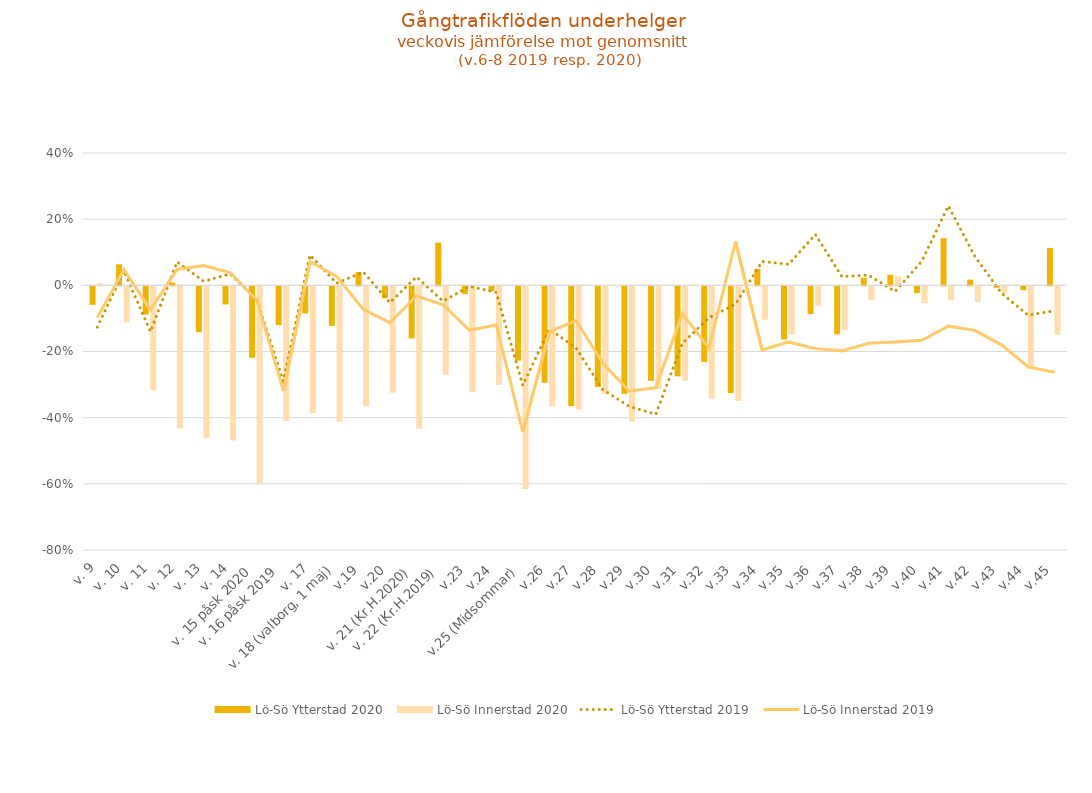
| Category | Lö-Sö |
|---|---|
| v. 9 | 0.007 |
| v. 10 | -0.109 |
| v. 11 | -0.315 |
| v. 12 | -0.429 |
| v. 13 | -0.458 |
| v. 14 | -0.466 |
| v. 15 påsk 2020 | -0.594 |
| v. 16 påsk 2019 | -0.406 |
| v. 17 | -0.383 |
| v. 18 (valborg, 1 maj) | -0.409 |
| v.19 | -0.363 |
| v.20 | -0.321 |
| v. 21 (Kr.H.2020) | -0.43 |
| v. 22 (Kr.H.2019) | -0.267 |
| v.23 | -0.32 |
| v.24 | -0.298 |
| v.25 (Midsommar) | -0.613 |
| v.26 | -0.362 |
| v.27 | -0.371 |
| v.28 | -0.325 |
| v.29 | -0.409 |
| v.30 | -0.311 |
| v.31 | -0.285 |
| v.32 | -0.34 |
| v.33 | -0.347 |
| v.34 | -0.101 |
| v.35 | -0.144 |
| v.36 | -0.058 |
| v.37 | -0.133 |
| v.38 | -0.042 |
| v.39 | 0.027 |
| v.40 | -0.051 |
| v.41 | -0.042 |
| v.42 | -0.047 |
| v.43 | -0.022 |
| v.44 | -0.251 |
| v.45 | -0.147 |